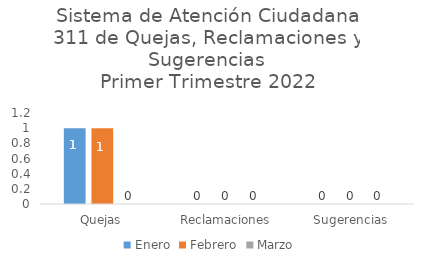
| Category | Enero | Febrero | Marzo |
|---|---|---|---|
| Quejas | 1 | 1 | 0 |
| Reclamaciones | 0 | 0 | 0 |
| Sugerencias | 0 | 0 | 0 |